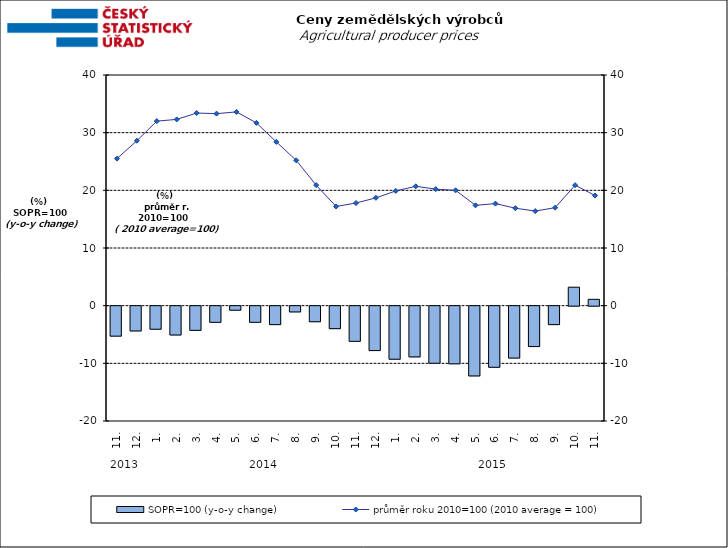
| Category | SOPR=100 (y-o-y change)   |
|---|---|
| 0 | -5.2 |
| 1 | -4.3 |
| 2 | -4 |
| 3 | -5 |
| 4 | -4.2 |
| 5 | -2.8 |
| 6 | -0.7 |
| 7 | -2.8 |
| 8 | -3.2 |
| 9 | -1 |
| 10 | -2.7 |
| 11 | -3.9 |
| 12 | -6.1 |
| 13 | -7.7 |
| 14 | -9.2 |
| 15 | -8.8 |
| 16 | -9.9 |
| 17 | -10 |
| 18 | -12.1 |
| 19 | -10.6 |
| 20 | -9 |
| 21 | -7 |
| 22 | -3.2 |
| 23 | 3.2 |
| 24 | 1.1 |